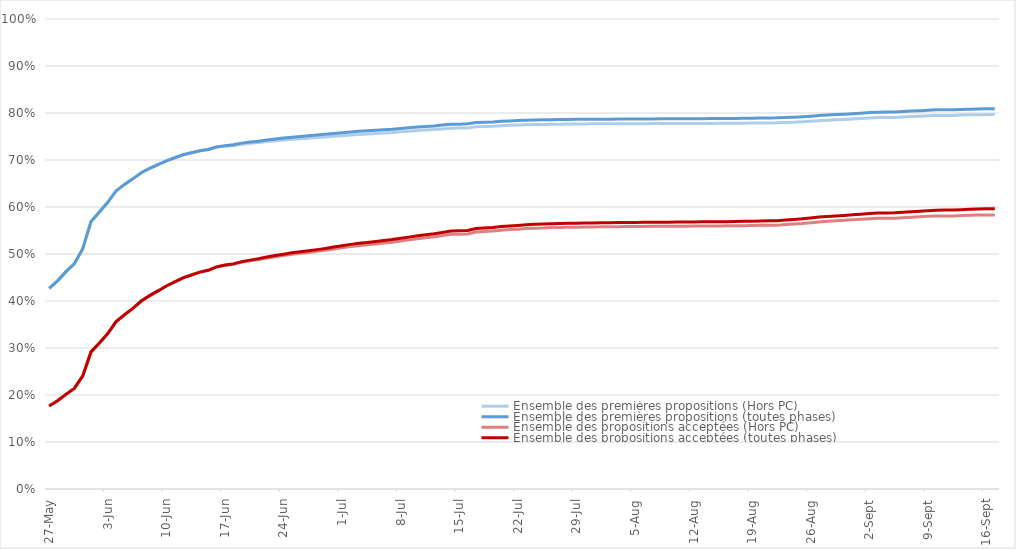
| Category | Ensemble des premières propositions (Hors PC) | Ensemble des premières propositions (toutes phases) | Ensemble des propositions acceptées (Hors PC) | Ensemble des propositions acceptées (toutes phases) |
|---|---|---|---|---|
| 2021-05-27 | 0.427 | 0.427 | 0.177 | 0.177 |
| 2021-05-28 | 0.443 | 0.443 | 0.188 | 0.188 |
| 2021-05-29 | 0.462 | 0.462 | 0.201 | 0.201 |
| 2021-05-30 | 0.479 | 0.479 | 0.214 | 0.214 |
| 2021-05-31 | 0.511 | 0.511 | 0.24 | 0.24 |
| 2021-06-01 | 0.569 | 0.569 | 0.292 | 0.292 |
| 2021-06-02 | 0.59 | 0.59 | 0.311 | 0.311 |
| 2021-06-03 | 0.61 | 0.61 | 0.331 | 0.331 |
| 2021-06-04 | 0.634 | 0.634 | 0.356 | 0.356 |
| 2021-06-05 | 0.648 | 0.648 | 0.371 | 0.371 |
| 2021-06-06 | 0.66 | 0.66 | 0.384 | 0.384 |
| 2021-06-07 | 0.673 | 0.673 | 0.4 | 0.4 |
| 2021-06-08 | 0.682 | 0.682 | 0.411 | 0.411 |
| 2021-06-09 | 0.69 | 0.69 | 0.421 | 0.421 |
| 2021-06-10 | 0.698 | 0.698 | 0.432 | 0.432 |
| 2021-06-11 | 0.705 | 0.705 | 0.441 | 0.441 |
| 2021-06-12 | 0.711 | 0.711 | 0.449 | 0.449 |
| 2021-06-13 | 0.715 | 0.715 | 0.455 | 0.455 |
| 2021-06-14 | 0.72 | 0.72 | 0.461 | 0.461 |
| 2021-06-15 | 0.722 | 0.722 | 0.465 | 0.465 |
| 2021-06-16 | 0.728 | 0.728 | 0.473 | 0.473 |
| 2021-06-17 | 0.729 | 0.731 | 0.476 | 0.476 |
| 2021-06-18 | 0.731 | 0.732 | 0.478 | 0.479 |
| 2021-06-19 | 0.734 | 0.736 | 0.482 | 0.484 |
| 2021-06-20 | 0.736 | 0.738 | 0.485 | 0.487 |
| 2021-06-21 | 0.737 | 0.74 | 0.488 | 0.49 |
| 2021-06-22 | 0.739 | 0.743 | 0.491 | 0.493 |
| 2021-06-23 | 0.741 | 0.745 | 0.494 | 0.497 |
| 2021-06-24 | 0.742 | 0.747 | 0.497 | 0.499 |
| 2021-06-25 | 0.744 | 0.749 | 0.499 | 0.503 |
| 2021-06-26 | 0.745 | 0.75 | 0.501 | 0.505 |
| 2021-06-27 | 0.746 | 0.752 | 0.503 | 0.507 |
| 2021-06-28 | 0.748 | 0.753 | 0.506 | 0.509 |
| 2021-06-29 | 0.749 | 0.755 | 0.508 | 0.512 |
| 2021-06-30 | 0.75 | 0.756 | 0.51 | 0.515 |
| 2021-07-01 | 0.752 | 0.758 | 0.513 | 0.518 |
| 2021-07-02 | 0.753 | 0.76 | 0.516 | 0.52 |
| 2021-07-03 | 0.754 | 0.761 | 0.518 | 0.523 |
| 2021-07-04 | 0.755 | 0.762 | 0.519 | 0.524 |
| 2021-07-05 | 0.756 | 0.763 | 0.521 | 0.527 |
| 2021-07-06 | 0.757 | 0.764 | 0.523 | 0.529 |
| 2021-07-07 | 0.758 | 0.765 | 0.525 | 0.531 |
| 2021-07-08 | 0.76 | 0.767 | 0.528 | 0.533 |
| 2021-07-09 | 0.761 | 0.769 | 0.53 | 0.536 |
| 2021-07-10 | 0.763 | 0.77 | 0.533 | 0.539 |
| 2021-07-11 | 0.764 | 0.771 | 0.535 | 0.541 |
| 2021-07-12 | 0.765 | 0.773 | 0.537 | 0.543 |
| 2021-07-13 | 0.766 | 0.774 | 0.539 | 0.546 |
| 2021-07-14 | 0.768 | 0.776 | 0.542 | 0.549 |
| 2021-07-15 | 0.768 | 0.776 | 0.542 | 0.549 |
| 2021-07-16 | 0.768 | 0.777 | 0.543 | 0.55 |
| 2021-07-17 | 0.771 | 0.78 | 0.547 | 0.554 |
| 2021-07-18 | 0.771 | 0.78 | 0.548 | 0.555 |
| 2021-07-19 | 0.772 | 0.781 | 0.549 | 0.556 |
| 2021-07-20 | 0.773 | 0.782 | 0.551 | 0.558 |
| 2021-07-21 | 0.774 | 0.783 | 0.552 | 0.56 |
| 2021-07-22 | 0.774 | 0.784 | 0.553 | 0.561 |
| 2021-07-23 | 0.775 | 0.785 | 0.554 | 0.562 |
| 2021-07-24 | 0.775 | 0.785 | 0.555 | 0.563 |
| 2021-07-25 | 0.776 | 0.785 | 0.556 | 0.564 |
| 2021-07-26 | 0.776 | 0.786 | 0.556 | 0.564 |
| 2021-07-27 | 0.776 | 0.786 | 0.557 | 0.565 |
| 2021-07-28 | 0.776 | 0.786 | 0.557 | 0.565 |
| 2021-07-29 | 0.777 | 0.786 | 0.557 | 0.566 |
| 2021-07-30 | 0.777 | 0.787 | 0.558 | 0.566 |
| 2021-07-31 | 0.777 | 0.787 | 0.558 | 0.566 |
| 2021-08-01 | 0.777 | 0.787 | 0.558 | 0.566 |
| 2021-08-02 | 0.777 | 0.787 | 0.558 | 0.566 |
| 2021-08-03 | 0.777 | 0.787 | 0.558 | 0.567 |
| 2021-08-04 | 0.777 | 0.787 | 0.558 | 0.567 |
| 2021-08-05 | 0.777 | 0.787 | 0.558 | 0.567 |
| 2021-08-06 | 0.777 | 0.787 | 0.559 | 0.567 |
| 2021-08-07 | 0.777 | 0.787 | 0.559 | 0.568 |
| 2021-08-08 | 0.777 | 0.788 | 0.559 | 0.568 |
| 2021-08-09 | 0.778 | 0.788 | 0.559 | 0.568 |
| 2021-08-10 | 0.778 | 0.788 | 0.559 | 0.568 |
| 2021-08-11 | 0.778 | 0.788 | 0.559 | 0.568 |
| 2021-08-12 | 0.778 | 0.788 | 0.559 | 0.568 |
| 2021-08-13 | 0.778 | 0.788 | 0.56 | 0.568 |
| 2021-08-14 | 0.778 | 0.788 | 0.56 | 0.569 |
| 2021-08-15 | 0.778 | 0.788 | 0.56 | 0.569 |
| 2021-08-16 | 0.778 | 0.788 | 0.56 | 0.569 |
| 2021-08-17 | 0.778 | 0.788 | 0.56 | 0.569 |
| 2021-08-18 | 0.778 | 0.789 | 0.56 | 0.569 |
| 2021-08-19 | 0.779 | 0.789 | 0.561 | 0.57 |
| 2021-08-20 | 0.779 | 0.789 | 0.561 | 0.57 |
| 2021-08-21 | 0.779 | 0.79 | 0.561 | 0.571 |
| 2021-08-22 | 0.779 | 0.79 | 0.561 | 0.571 |
| 2021-08-23 | 0.78 | 0.79 | 0.563 | 0.572 |
| 2021-08-24 | 0.78 | 0.791 | 0.564 | 0.574 |
| 2021-08-25 | 0.781 | 0.792 | 0.565 | 0.575 |
| 2021-08-26 | 0.782 | 0.793 | 0.567 | 0.577 |
| 2021-08-27 | 0.784 | 0.795 | 0.568 | 0.579 |
| 2021-08-28 | 0.785 | 0.796 | 0.57 | 0.58 |
| 2021-08-29 | 0.786 | 0.797 | 0.571 | 0.581 |
| 2021-08-30 | 0.786 | 0.798 | 0.572 | 0.582 |
| 2021-08-31 | 0.787 | 0.799 | 0.573 | 0.583 |
| 2021-09-01 | 0.788 | 0.8 | 0.574 | 0.585 |
| 2021-09-02 | 0.789 | 0.801 | 0.575 | 0.586 |
| 2021-09-03 | 0.79 | 0.802 | 0.576 | 0.587 |
| 2021-09-04 | 0.79 | 0.802 | 0.576 | 0.587 |
| 2021-09-05 | 0.79 | 0.802 | 0.576 | 0.588 |
| 2021-09-06 | 0.792 | 0.803 | 0.577 | 0.589 |
| 2021-09-07 | 0.792 | 0.804 | 0.578 | 0.59 |
| 2021-09-08 | 0.793 | 0.805 | 0.579 | 0.591 |
| 2021-09-09 | 0.794 | 0.806 | 0.58 | 0.592 |
| 2021-09-10 | 0.795 | 0.807 | 0.581 | 0.593 |
| 2021-09-11 | 0.795 | 0.807 | 0.581 | 0.593 |
| 2021-09-12 | 0.795 | 0.807 | 0.581 | 0.594 |
| 2021-09-13 | 0.795 | 0.808 | 0.582 | 0.594 |
| 2021-09-14 | 0.796 | 0.808 | 0.582 | 0.595 |
| 2021-09-15 | 0.796 | 0.809 | 0.583 | 0.596 |
| 2021-09-16 | 0.797 | 0.809 | 0.583 | 0.596 |
| 2021-09-17 | 0.797 | 0.809 | 0.583 | 0.596 |